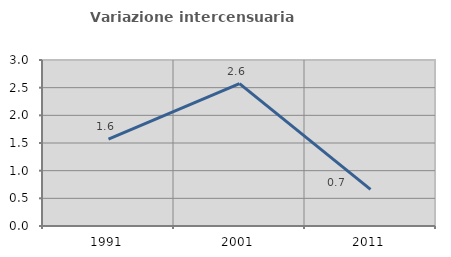
| Category | Variazione intercensuaria annua |
|---|---|
| 1991.0 | 1.568 |
| 2001.0 | 2.573 |
| 2011.0 | 0.661 |